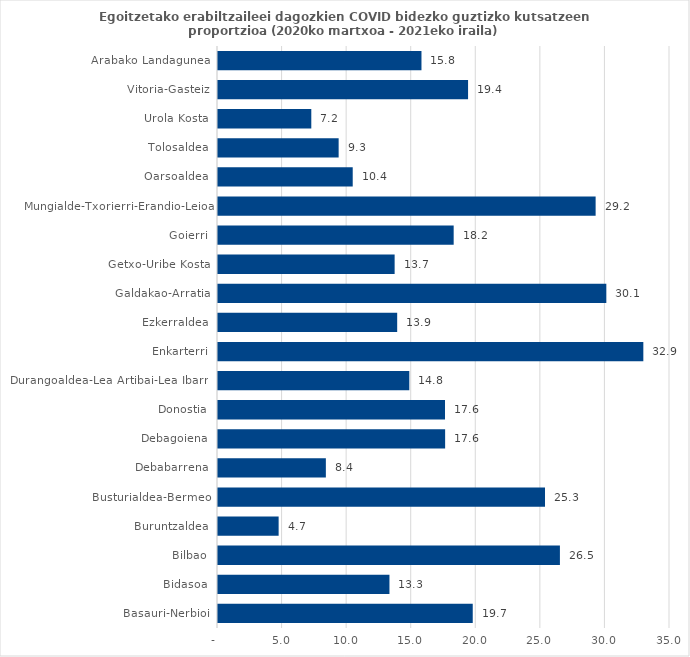
| Category | Series 0 |
|---|---|
| Basauri-Nerbioi | 19.726 |
| Bidasoa | 13.276 |
| Bilbao | 26.475 |
| Buruntzaldea | 4.695 |
| Busturialdea-Bermeo | 25.321 |
| Debabarrena | 8.352 |
| Debagoiena | 17.588 |
| Donostia | 17.578 |
| Durangoaldea-Lea Artibai-Lea Ibarra | 14.813 |
| Enkarterri | 32.935 |
| Ezkerraldea | 13.875 |
| Galdakao-Arratia | 30.07 |
| Getxo-Uribe Kosta | 13.677 |
| Goierri | 18.249 |
| Mungialde-Txorierri-Erandio-Leioa | 29.241 |
| Oarsoaldea | 10.432 |
| Tolosaldea | 9.342 |
| Urola Kosta | 7.225 |
| Vitoria-Gasteiz | 19.364 |
| Arabako Landagunea | 15.755 |